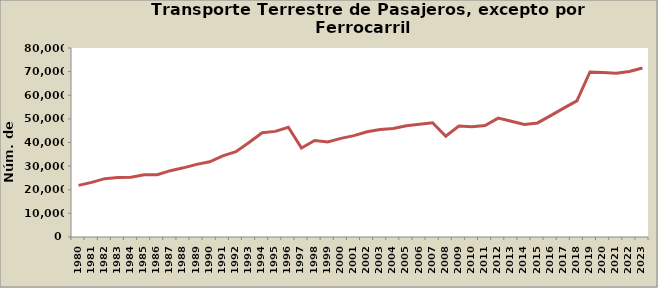
| Category | Series 0 |
|---|---|
| 1980.0 | 21840 |
| 1981.0 | 23120 |
| 1982.0 | 24701 |
| 1983.0 | 25225 |
| 1984.0 | 25268 |
| 1985.0 | 26316 |
| 1986.0 | 26382 |
| 1987.0 | 28073 |
| 1988.0 | 29279 |
| 1989.0 | 30735 |
| 1990.0 | 31811 |
| 1991.0 | 34380 |
| 1992.0 | 36140 |
| 1993.0 | 39997 |
| 1994.0 | 44109 |
| 1995.0 | 44711 |
| 1996.0 | 46427 |
| 1997.0 | 37643 |
| 1998.0 | 40846 |
| 1999.0 | 40197 |
| 2000.0 | 41758 |
| 2001.0 | 42899 |
| 2002.0 | 44573 |
| 2003.0 | 45485 |
| 2004.0 | 45906 |
| 2005.0 | 47092 |
| 2006.0 | 47751 |
| 2007.0 | 48374 |
| 2008.0 | 42648 |
| 2009.0 | 46948 |
| 2010.0 | 46658 |
| 2011.0 | 47172 |
| 2012.0 | 50312 |
| 2013.0 | 48981 |
| 2014.0 | 47610 |
| 2015.0 | 48287 |
| 2016.0 | 51371 |
| 2017.0 | 54531 |
| 2018.0 | 57599 |
| 2019.0 | 69871 |
| 2020.0 | 69624 |
| 2021.0 | 69330 |
| 2022.0 | 70056 |
| 2023.0 | 71562 |